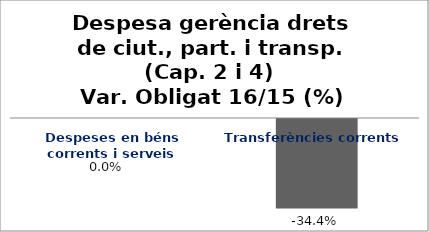
| Category | Series 0 |
|---|---|
| Despeses en béns corrents i serveis | 0 |
| Transferències corrents | -0.344 |